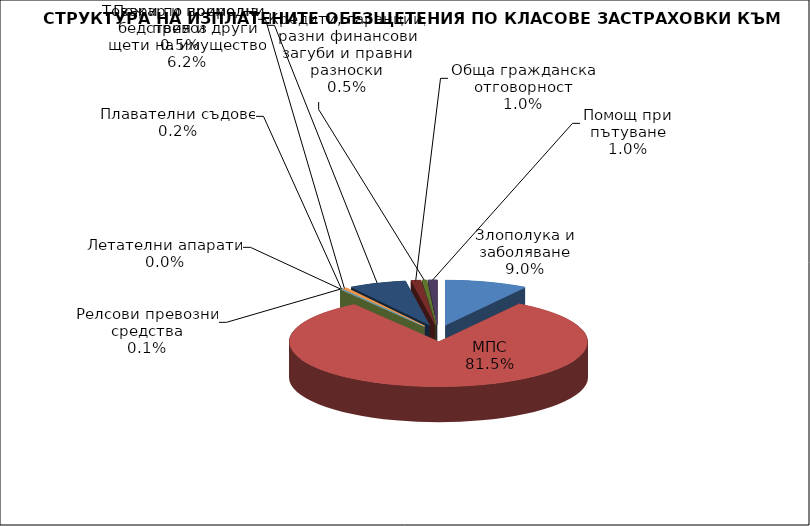
| Category | Злополука и заболяване |
|---|---|
| Злополука и заболяване | 0.09 |
| МПС | 0.815 |
| Релсови превозни средства | 0.001 |
| Летателни апарати | 0 |
| Плавателни съдове | 0.002 |
| Товари по време на превоз | 0.005 |
| Пожар и природни бедствия и други щети на имущество | 0.062 |
| Обща гражданска отговорност | 0.01 |
| Кредити, гаранции, разни финансови загуби и правни разноски | 0.005 |
| Помощ при пътуване | 0.01 |